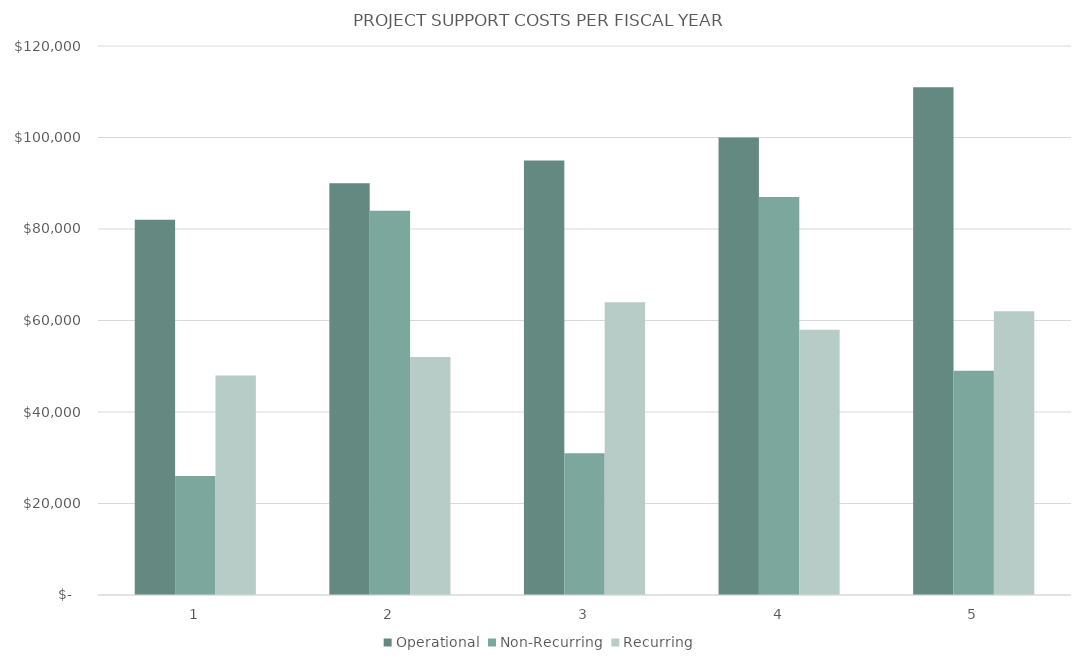
| Category | Operational | Non-Recurring | Recurring |
|---|---|---|---|
| 0 | 82000 | 26000 | 48000 |
| 1 | 90000 | 84000 | 52000 |
| 2 | 95000 | 31000 | 64000 |
| 3 | 100000 | 87000 | 58000 |
| 4 | 111000 | 49000 | 62000 |